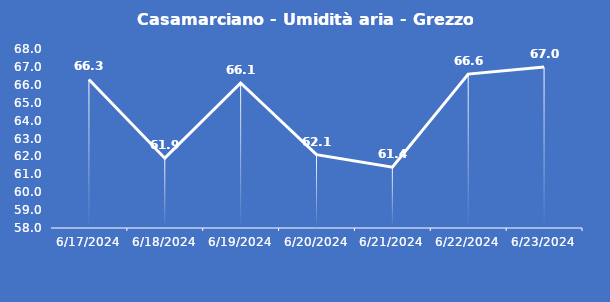
| Category | Casamarciano - Umidità aria - Grezzo (%) |
|---|---|
| 6/17/24 | 66.3 |
| 6/18/24 | 61.9 |
| 6/19/24 | 66.1 |
| 6/20/24 | 62.1 |
| 6/21/24 | 61.4 |
| 6/22/24 | 66.6 |
| 6/23/24 | 67 |